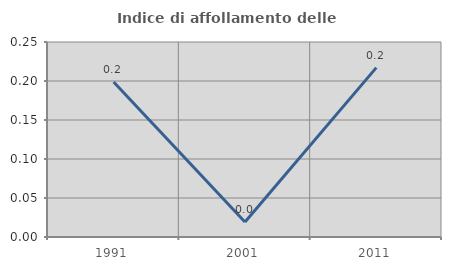
| Category | Indice di affollamento delle abitazioni  |
|---|---|
| 1991.0 | 0.199 |
| 2001.0 | 0.019 |
| 2011.0 | 0.217 |